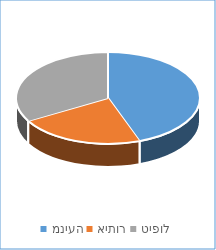
| Category | Series 0 |
|---|---|
| מניעה | 4 |
| איתור | 2 |
| טיפול | 3 |